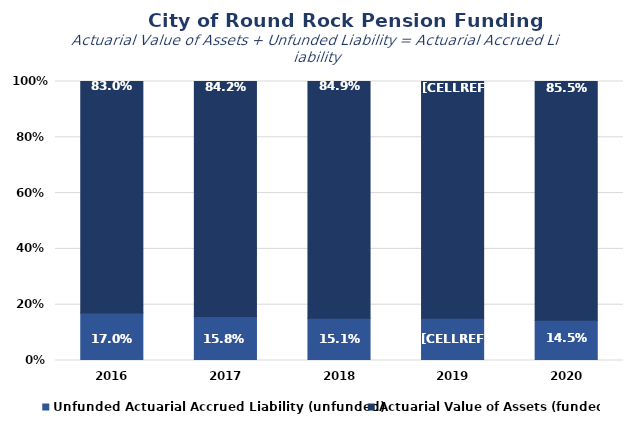
| Category | Unfunded Actuarial Accrued Liability (unfunded) | Actuarial Value of Assets (funded) |
|---|---|---|
| 2016.0 | 40974851 | 199934948 |
| 2017.0 | 41151214 | 219738526 |
| 2018.0 | 42871020 | 240615691 |
| 2019.0 | 47134730 | 264071563 |
| 2020.0 | 48888932 | 289345110 |